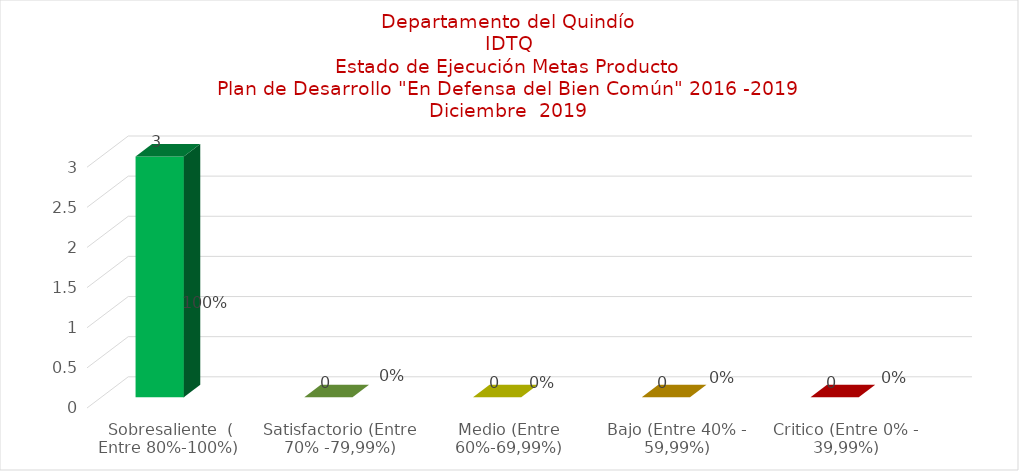
| Category |  METAS PRODUCTO | % |
|---|---|---|
| Sobresaliente  ( Entre 80%-100%)  | 3 | 1 |
| Satisfactorio (Entre 70% -79,99%) | 0 | 0 |
| Medio (Entre 60%-69,99%) | 0 | 0 |
| Bajo (Entre 40% - 59,99%) | 0 | 0 |
| Critico (Entre 0% - 39,99%) | 0 | 0 |